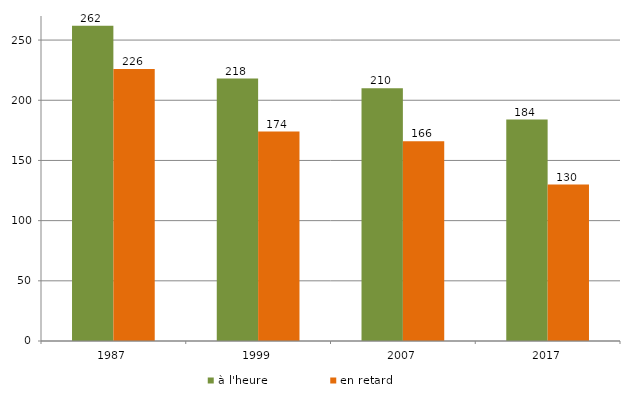
| Category | à l'heure | en retard |
|---|---|---|
| 1987.0 | 262 | 226 |
| 1999.0 | 218 | 174 |
| 2007.0 | 210 | 166 |
| 2017.0 | 184 | 130 |